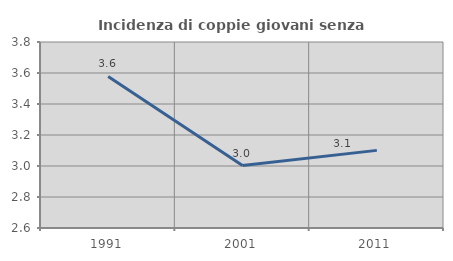
| Category | Incidenza di coppie giovani senza figli |
|---|---|
| 1991.0 | 3.578 |
| 2001.0 | 3.003 |
| 2011.0 | 3.101 |